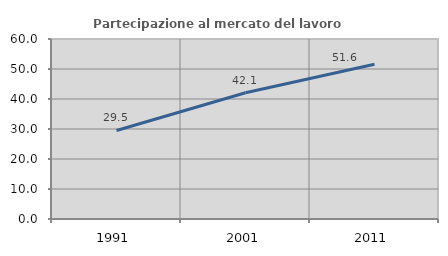
| Category | Partecipazione al mercato del lavoro  femminile |
|---|---|
| 1991.0 | 29.508 |
| 2001.0 | 42.083 |
| 2011.0 | 51.562 |